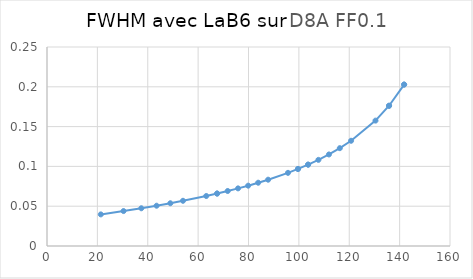
| Category | Series 0 |
|---|---|
| 21.3589 | 0.04 |
| 30.3862 | 0.044 |
| 37.4436 | 0.047 |
| 43.5087 | 0.051 |
| 48.9599 | 0.054 |
| 53.9915 | 0.057 |
| 63.2216 | 0.063 |
| 67.5512 | 0.066 |
| 67.5512 | 0.066 |
| 71.7493 | 0.069 |
| 75.8481 | 0.072 |
| 79.8742 | 0.076 |
| 83.8502 | 0.08 |
| 87.7967 | 0.083 |
| 95.6769 | 0.092 |
| 99.6484 | 0.097 |
| 99.6484 | 0.097 |
| 103.6673 | 0.102 |
| 103.6673 | 0.102 |
| 107.7562 | 0.108 |
| 111.9408 | 0.115 |
| 116.2527 | 0.123 |
| 120.7314 | 0.132 |
| 130.4195 | 0.158 |
| 135.8124 | 0.176 |
| 135.8124 | 0.176 |
| 141.7895 | 0.203 |
| 141.7895 | 0.203 |